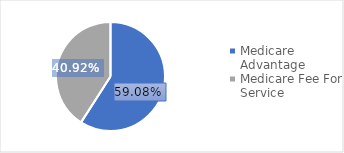
| Category | Series 0 |
|---|---|
| Medicare Advantage | 0.591 |
| Medicare Fee For Service | 0.409 |